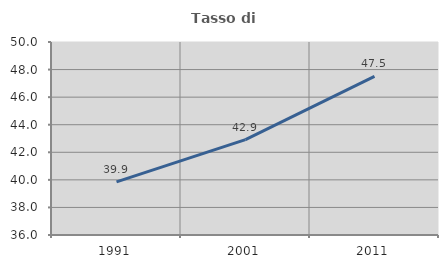
| Category | Tasso di occupazione   |
|---|---|
| 1991.0 | 39.852 |
| 2001.0 | 42.913 |
| 2011.0 | 47.5 |